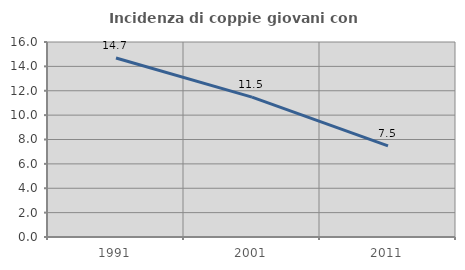
| Category | Incidenza di coppie giovani con figli |
|---|---|
| 1991.0 | 14.688 |
| 2001.0 | 11.475 |
| 2011.0 | 7.471 |